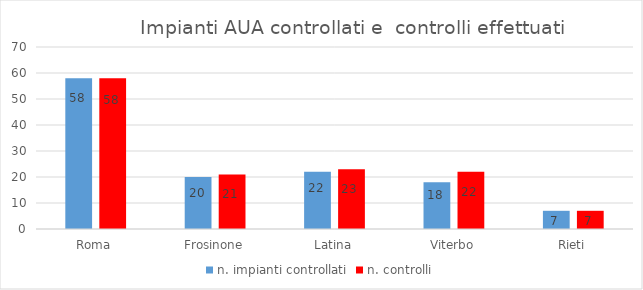
| Category | n. impianti controllati | n. controlli |
|---|---|---|
| Roma | 58 | 58 |
| Frosinone | 20 | 21 |
| Latina | 22 | 23 |
| Viterbo | 18 | 22 |
| Rieti | 7 | 7 |